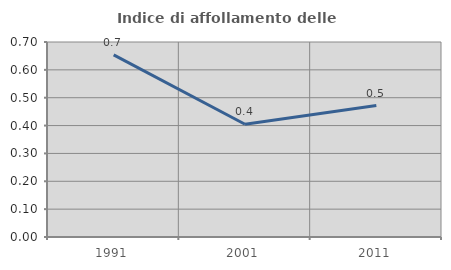
| Category | Indice di affollamento delle abitazioni  |
|---|---|
| 1991.0 | 0.654 |
| 2001.0 | 0.405 |
| 2011.0 | 0.472 |